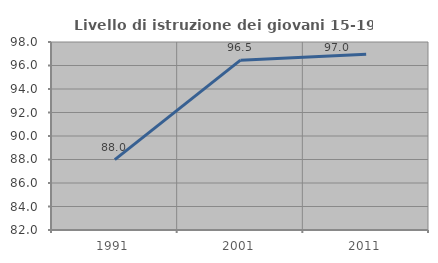
| Category | Livello di istruzione dei giovani 15-19 anni |
|---|---|
| 1991.0 | 87.984 |
| 2001.0 | 96.454 |
| 2011.0 | 96.96 |